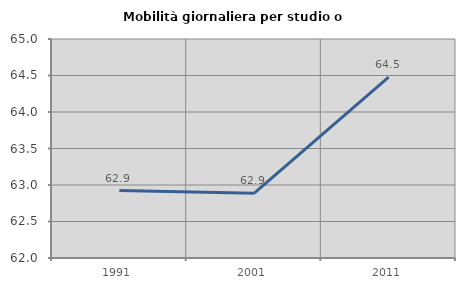
| Category | Mobilità giornaliera per studio o lavoro |
|---|---|
| 1991.0 | 62.924 |
| 2001.0 | 62.887 |
| 2011.0 | 64.477 |